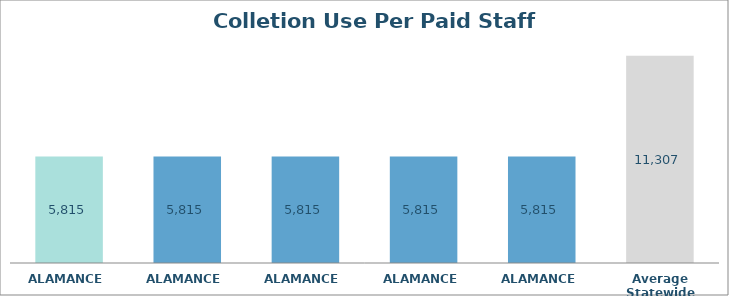
| Category | Series 0 |
|---|---|
| ALAMANCE  | 5814.723 |
| ALAMANCE  | 5814.723 |
| ALAMANCE  | 5814.723 |
| ALAMANCE  | 5814.723 |
| ALAMANCE  | 5814.723 |
| Average Statewide | 11306.862 |